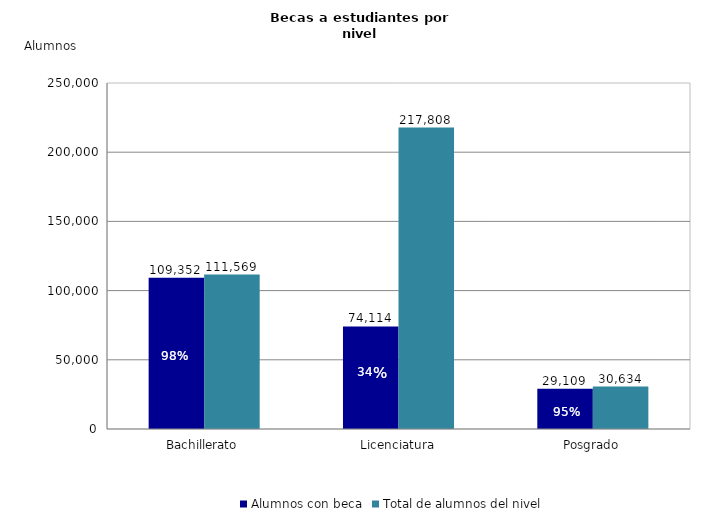
| Category | Alumnos con beca | Total de alumnos del nivel |
|---|---|---|
| Bachillerato | 109352 | 111569 |
| Licenciatura | 74114 | 217808 |
| Posgrado | 29109 | 30634 |